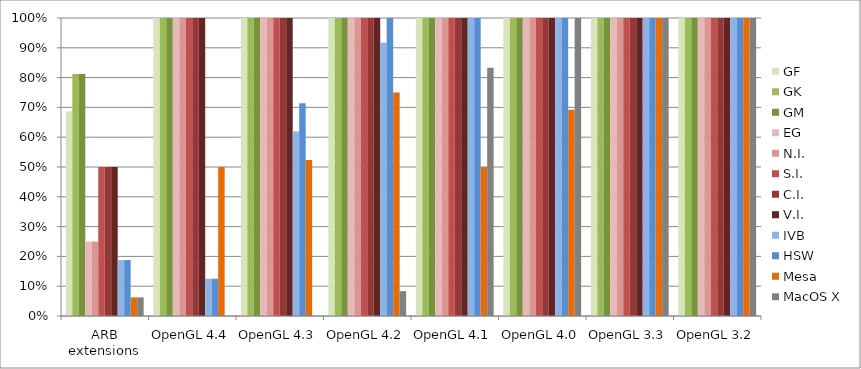
| Category | GF | GK | GM | EG | N.I. | S.I. | C.I. | V.I. | IVB | HSW | Mesa | MacOS X |
|---|---|---|---|---|---|---|---|---|---|---|---|---|
| ARB extensions | 0.688 | 0.812 | 0.812 | 0.25 | 0.25 | 0.5 | 0.5 | 0.5 | 0.188 | 0.188 | 0.062 | 0.062 |
| OpenGL 4.4 | 1 | 1 | 1 | 1 | 1 | 1 | 1 | 1 | 0.125 | 0.125 | 0.5 | 0 |
| OpenGL 4.3 | 1 | 1 | 1 | 1 | 1 | 1 | 1 | 1 | 0.619 | 0.714 | 0.524 | 0 |
| OpenGL 4.2 | 1 | 1 | 1 | 1 | 1 | 1 | 1 | 1 | 0.917 | 1 | 0.75 | 0.083 |
| OpenGL 4.1 | 1 | 1 | 1 | 1 | 1 | 1 | 1 | 1 | 1 | 1 | 0.5 | 0.833 |
| OpenGL 4.0 | 1 | 1 | 1 | 1 | 1 | 1 | 1 | 1 | 1 | 1 | 0.692 | 1 |
| OpenGL 3.3 | 1 | 1 | 1 | 1 | 1 | 1 | 1 | 1 | 1 | 1 | 1 | 1 |
| OpenGL 3.2 | 1 | 1 | 1 | 1 | 1 | 1 | 1 | 1 | 1 | 1 | 1 | 1 |